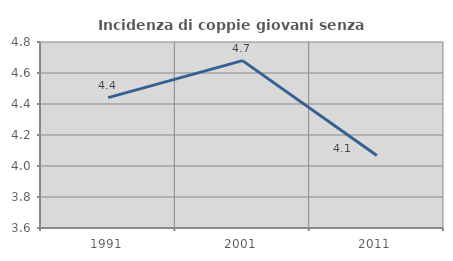
| Category | Incidenza di coppie giovani senza figli |
|---|---|
| 1991.0 | 4.441 |
| 2001.0 | 4.68 |
| 2011.0 | 4.068 |